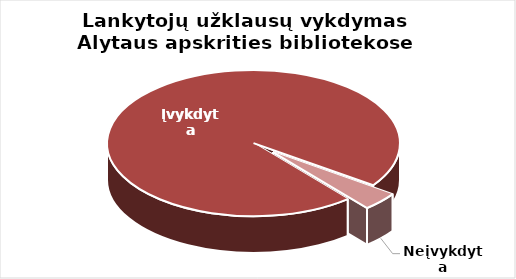
| Category | Series 0 |
|---|---|
| Įvykdyta | 29775 |
| Neįvykdyta | 1274 |